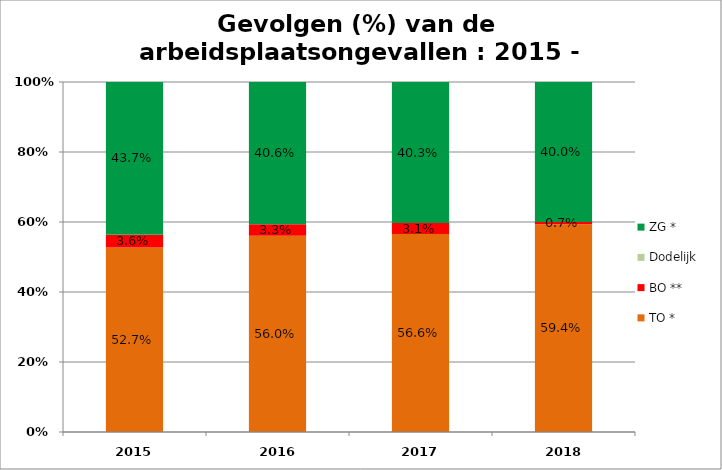
| Category | TO * | BO ** | Dodelijk | ZG * |
|---|---|---|---|---|
| 0 | 0.527 | 0.036 | 0 | 0.437 |
| 1 | 0.56 | 0.033 | 0 | 0.406 |
| 2 | 0.566 | 0.031 | 0 | 0.403 |
| 3 | 0.594 | 0.007 | 0 | 0.4 |